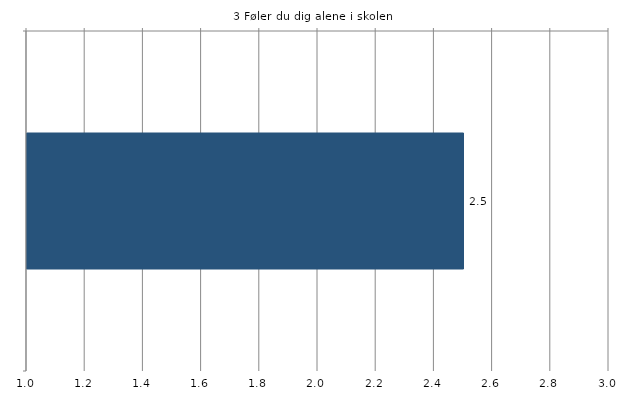
| Category | Gns. |
|---|---|
|   | 2.5 |